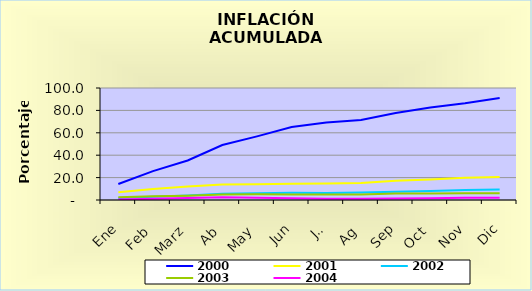
| Category | 2000 | 2001 | 2002 | 2003 | 2004 |
|---|---|---|---|---|---|
| Ene | 14.3 | 7 | 1.8 | 2.48 | 0.41 |
| Feb | 25.8 | 9.9 | 2.9 | 3.25 | 1.1 |
| Marz | 35.3 | 12.1 | 4 | 3.82 | 1.81 |
| Ab | 49.1 | 13.8 | 5.49 | 4.86 | 2.47 |
| May | 56.8 | 14 | 5.98 | 5.05 | 2 |
| Jun | 65.1 | 14.5 | 6.37 | 4.83 | 1.67 |
| Jul | 69.1 | 14.7 | 6.3 | 4.86 | 1.04 |
| Ag | 71.4 | 15.1 | 6.74 | 4.92 | 1.068 |
| Sep | 77.7 | 17.1 | 7.32 | 5.75 | 1.31 |
| Oct | 82.5 | 18.3 | 7.97 | 5.76 | 1.59 |
| Nov | 86.4 | 19.9 | 8.98 | 6.11 | 2 |
| Dic | 91 | 20.6 | 9.36 | 6.11 | 1.95 |